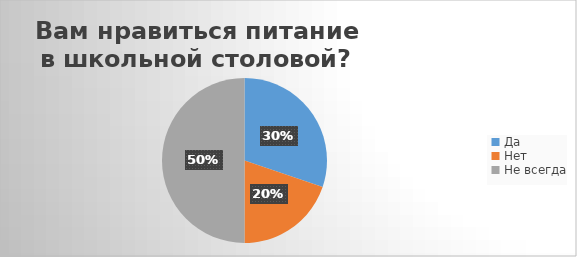
| Category | Series 0 |
|---|---|
| Да | 29 |
| Нет | 19 |
| Не всегда | 48 |